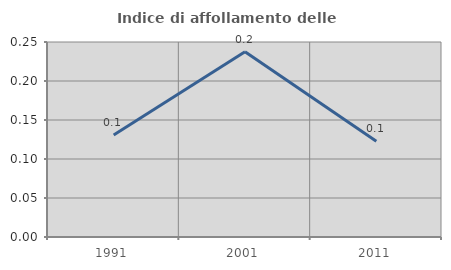
| Category | Indice di affollamento delle abitazioni  |
|---|---|
| 1991.0 | 0.131 |
| 2001.0 | 0.238 |
| 2011.0 | 0.123 |